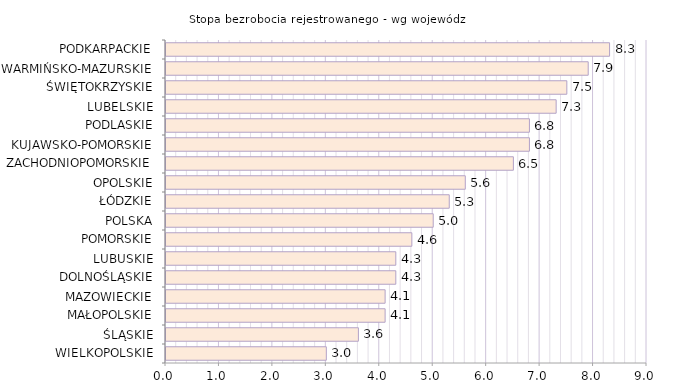
| Category | Stopa bezrobocia rejestrowanego - wg województw |
|---|---|
| WIELKOPOLSKIE | 3 |
| ŚLĄSKIE | 3.6 |
| MAŁOPOLSKIE | 4.1 |
| MAZOWIECKIE | 4.1 |
| DOLNOŚLĄSKIE | 4.3 |
| LUBUSKIE | 4.3 |
| POMORSKIE | 4.6 |
| POLSKA | 5 |
| ŁÓDZKIE | 5.3 |
| OPOLSKIE | 5.6 |
| ZACHODNIOPOMORSKIE | 6.5 |
| KUJAWSKO-POMORSKIE | 6.8 |
| PODLASKIE | 6.8 |
| LUBELSKIE | 7.3 |
| ŚWIĘTOKRZYSKIE | 7.5 |
| WARMIŃSKO-MAZURSKIE | 7.9 |
| PODKARPACKIE | 8.3 |